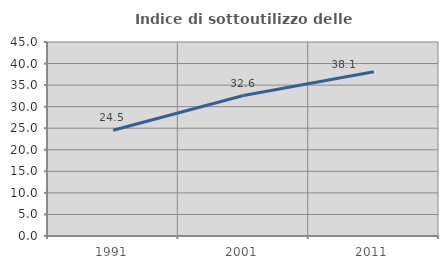
| Category | Indice di sottoutilizzo delle abitazioni  |
|---|---|
| 1991.0 | 24.519 |
| 2001.0 | 32.578 |
| 2011.0 | 38.119 |